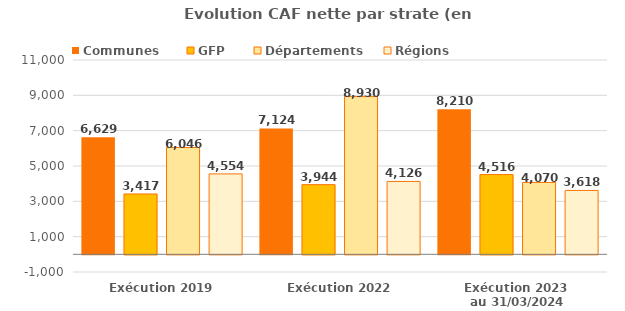
| Category | Communes  | GFP | Départements | Régions |
|---|---|---|---|---|
| Exécution 2019 | 6629.4 | 3416.6 | 6045.7 | 4554.1 |
| Exécution 2022 | 7123.6 | 3944.2 | 8930.2 | 4125.7 |
| Exécution 2023 
au 31/03/2024 | 8210 | 4515.5 | 4069.5 | 3617.5 |